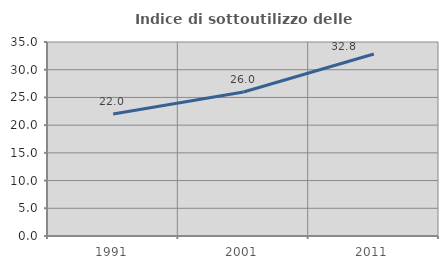
| Category | Indice di sottoutilizzo delle abitazioni  |
|---|---|
| 1991.0 | 22.008 |
| 2001.0 | 25.972 |
| 2011.0 | 32.847 |